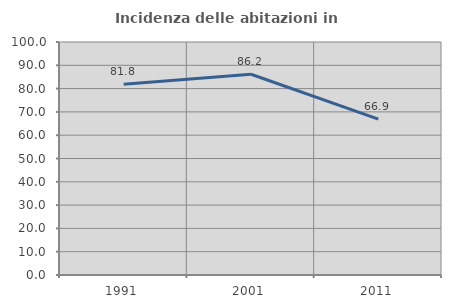
| Category | Incidenza delle abitazioni in proprietà  |
|---|---|
| 1991.0 | 81.842 |
| 2001.0 | 86.151 |
| 2011.0 | 66.875 |